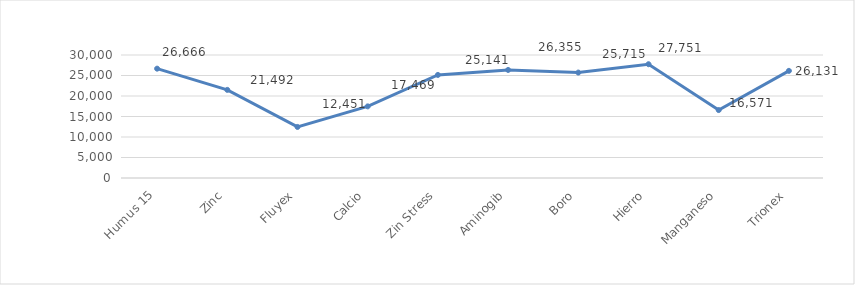
| Category | Series 0 |
|---|---|
| Humus 15 | 26666 |
| Zinc | 21492 |
| Fluyex | 12451 |
| Calcio | 17469 |
| Zin Stress | 25141 |
| Aminogib | 26355 |
| Boro | 25715 |
| Hierro | 27751 |
| Manganeso | 16571 |
| Trionex | 26131 |